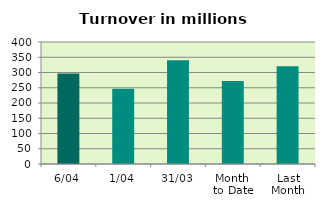
| Category | Series 0 |
|---|---|
| 6/04 | 296.445 |
| 1/04 | 247.042 |
| 31/03 | 339.927 |
| Month 
to Date | 271.744 |
| Last
Month | 320.663 |